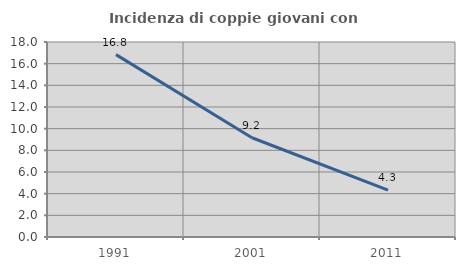
| Category | Incidenza di coppie giovani con figli |
|---|---|
| 1991.0 | 16.834 |
| 2001.0 | 9.162 |
| 2011.0 | 4.324 |